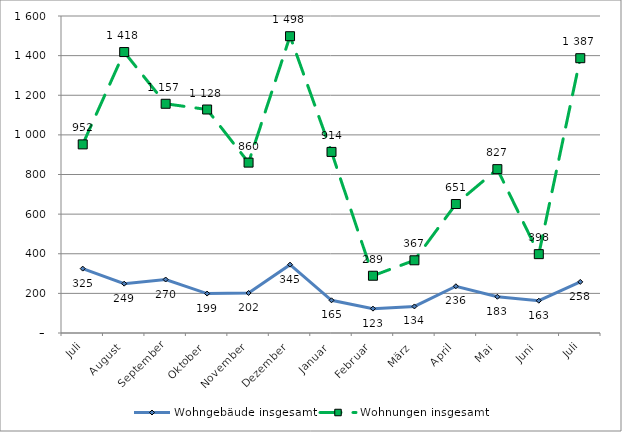
| Category | Wohngebäude insgesamt | Wohnungen insgesamt |
|---|---|---|
| Juli | 325 | 952 |
| August | 249 | 1418 |
| September | 270 | 1157 |
| Oktober | 199 | 1128 |
| November | 202 | 860 |
| Dezember | 345 | 1498 |
| Januar | 165 | 914 |
| Februar | 123 | 289 |
| März | 134 | 367 |
| April | 236 | 651 |
| Mai | 183 | 827 |
| Juni | 163 | 398 |
| Juli | 258 | 1387 |